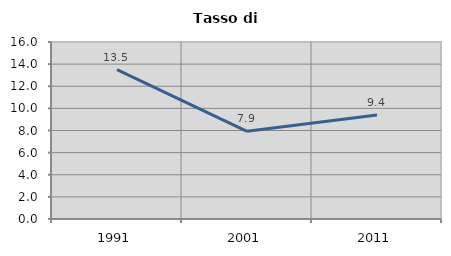
| Category | Tasso di disoccupazione   |
|---|---|
| 1991.0 | 13.495 |
| 2001.0 | 7.924 |
| 2011.0 | 9.401 |